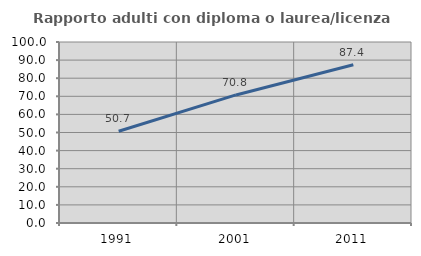
| Category | Rapporto adulti con diploma o laurea/licenza media  |
|---|---|
| 1991.0 | 50.682 |
| 2001.0 | 70.752 |
| 2011.0 | 87.449 |